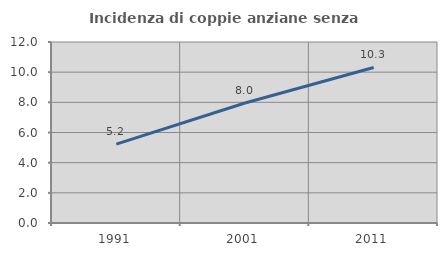
| Category | Incidenza di coppie anziane senza figli  |
|---|---|
| 1991.0 | 5.225 |
| 2001.0 | 7.955 |
| 2011.0 | 10.313 |